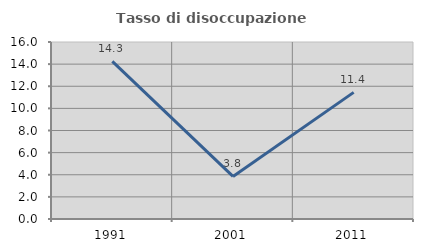
| Category | Tasso di disoccupazione giovanile  |
|---|---|
| 1991.0 | 14.252 |
| 2001.0 | 3.846 |
| 2011.0 | 11.446 |